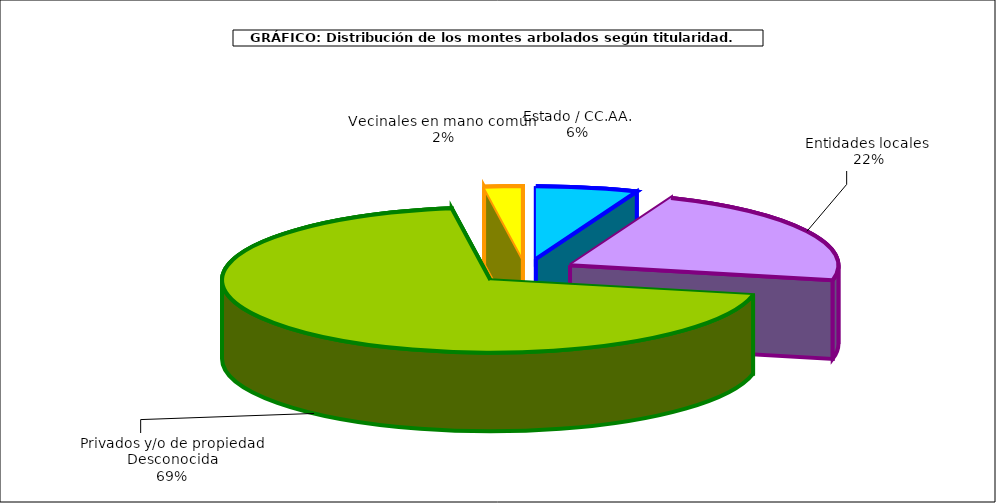
| Category | Series 0 |
|---|---|
| Estado / CC.AA. | 1139687.902 |
| Entidades locales  | 4118577.193 |
| Privados y/o de propiedad Desconocida | 12893849.513 |
| Vecinales en mano común  | 428502.464 |